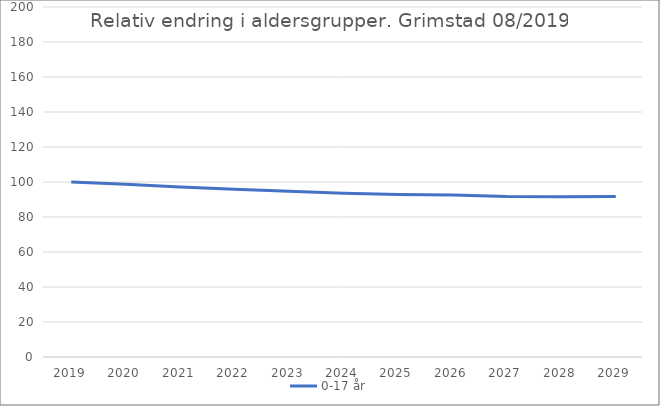
| Category | 0-17 år |
|---|---|
| 2019 | 100 |
| 2020 | 98.773 |
| 2021 | 97.073 |
| 2022 | 95.816 |
| 2023 | 94.689 |
| 2024 | 93.598 |
| 2025 | 92.927 |
| 2026 | 92.579 |
| 2027 | 91.678 |
| 2028 | 91.635 |
| 2029 | 91.683 |